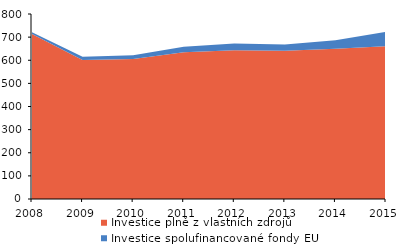
| Category | Investice plně z vlastních zdrojů | Investice spolufinancované fondy EU |
|---|---|---|
| 2008.0 | 713.082 | 7.52 |
| 2009.0 | 600.986 | 14.514 |
| 2010.0 | 604.939 | 16.818 |
| 2011.0 | 634.552 | 23.495 |
| 2012.0 | 643.687 | 28.407 |
| 2013.0 | 640.92 | 27.631 |
| 2014.0 | 649.416 | 36.556 |
| 2015.0 | 660.732 | 62.496 |